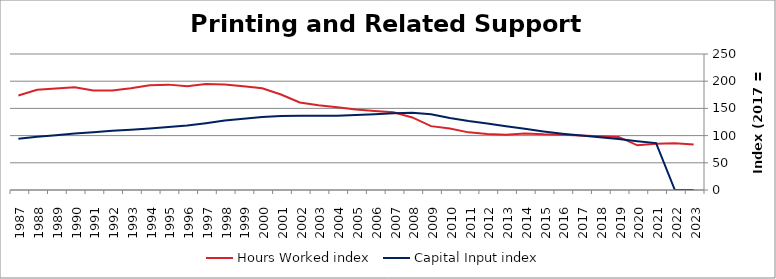
| Category | Hours Worked index | Capital Input index |
|---|---|---|
| 2023.0 | 83.513 | 0 |
| 2022.0 | 86.066 | 0 |
| 2021.0 | 85.175 | 86.176 |
| 2020.0 | 82.18 | 89.562 |
| 2019.0 | 97.525 | 93.577 |
| 2018.0 | 98.695 | 96.92 |
| 2017.0 | 100 | 100 |
| 2016.0 | 101.571 | 103.512 |
| 2015.0 | 102.271 | 107.727 |
| 2014.0 | 103.86 | 112.497 |
| 2013.0 | 101.58 | 117.301 |
| 2012.0 | 102.917 | 122.254 |
| 2011.0 | 105.963 | 126.965 |
| 2010.0 | 113.023 | 132.508 |
| 2009.0 | 117.412 | 139.332 |
| 2008.0 | 133.369 | 142.18 |
| 2007.0 | 142.936 | 140.899 |
| 2006.0 | 145.27 | 139.404 |
| 2005.0 | 147.98 | 137.955 |
| 2004.0 | 152.02 | 136.351 |
| 2003.0 | 155.763 | 136.358 |
| 2002.0 | 160.805 | 136.62 |
| 2001.0 | 175.625 | 135.811 |
| 2000.0 | 186.927 | 134.139 |
| 1999.0 | 190.59 | 131.04 |
| 1998.0 | 194.014 | 127.608 |
| 1997.0 | 194.658 | 122.832 |
| 1996.0 | 190.919 | 118.571 |
| 1995.0 | 193.701 | 115.744 |
| 1994.0 | 192.686 | 112.889 |
| 1993.0 | 187.118 | 110.601 |
| 1992.0 | 182.929 | 108.744 |
| 1991.0 | 183.092 | 106.218 |
| 1990.0 | 188.729 | 103.946 |
| 1989.0 | 186.696 | 100.675 |
| 1988.0 | 184.228 | 97.828 |
| 1987.0 | 173.803 | 94.35 |